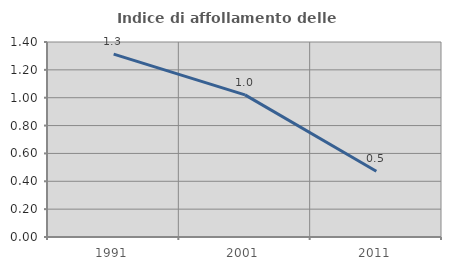
| Category | Indice di affollamento delle abitazioni  |
|---|---|
| 1991.0 | 1.313 |
| 2001.0 | 1.02 |
| 2011.0 | 0.472 |